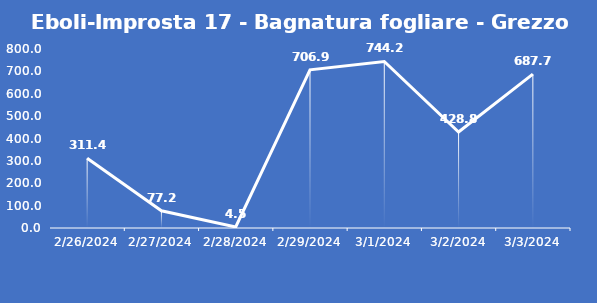
| Category | Eboli-Improsta 17 - Bagnatura fogliare - Grezzo (min) |
|---|---|
| 2/26/24 | 311.4 |
| 2/27/24 | 77.2 |
| 2/28/24 | 4.5 |
| 2/29/24 | 706.9 |
| 3/1/24 | 744.2 |
| 3/2/24 | 428.8 |
| 3/3/24 | 687.7 |